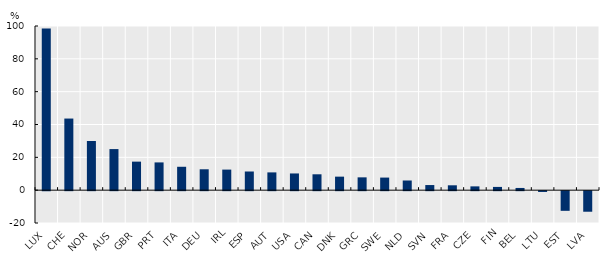
| Category | Series 0 |
|---|---|
| LUX | 98.432 |
| CHE | 43.624 |
| NOR | 29.938 |
| AUS | 25.029 |
| GBR | 17.378 |
| PRT | 16.908 |
| ITA | 14.248 |
| DEU | 12.726 |
| IRL | 12.53 |
| ESP | 11.373 |
| AUT | 10.83 |
| USA | 10.182 |
| CAN | 9.669 |
| DNK | 8.238 |
| GRC | 7.808 |
| SWE | 7.667 |
| NLD | 5.892 |
| SVN | 3.118 |
| FRA | 2.966 |
| CZE | 2.311 |
| FIN | 1.978 |
| BEL | 1.35 |
| LTU | -0.484 |
| EST | -11.976 |
| LVA | -12.525 |